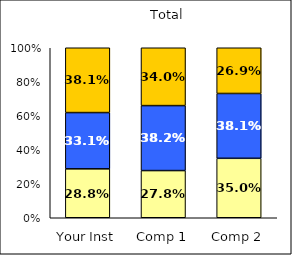
| Category | Low Civic Minded Practice | Average Civic Minded Practice | High Civic Minded Practice |
|---|---|---|---|
| Your Inst | 0.288 | 0.331 | 0.381 |
| Comp 1 | 0.278 | 0.382 | 0.34 |
| Comp 2 | 0.35 | 0.381 | 0.269 |